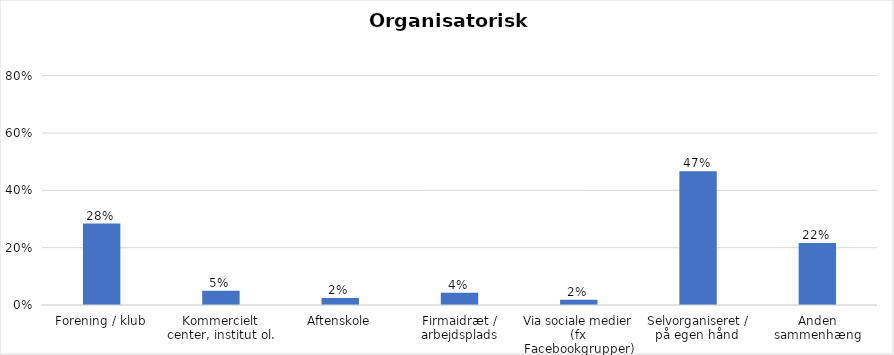
| Category | % |
|---|---|
| Forening / klub | 0.284 |
| Kommercielt center, institut ol. | 0.05 |
| Aftenskole | 0.024 |
| Firmaidræt / arbejdsplads | 0.042 |
| Via sociale medier (fx Facebookgrupper) | 0.018 |
| Selvorganiseret / på egen hånd  | 0.467 |
| Anden sammenhæng | 0.216 |